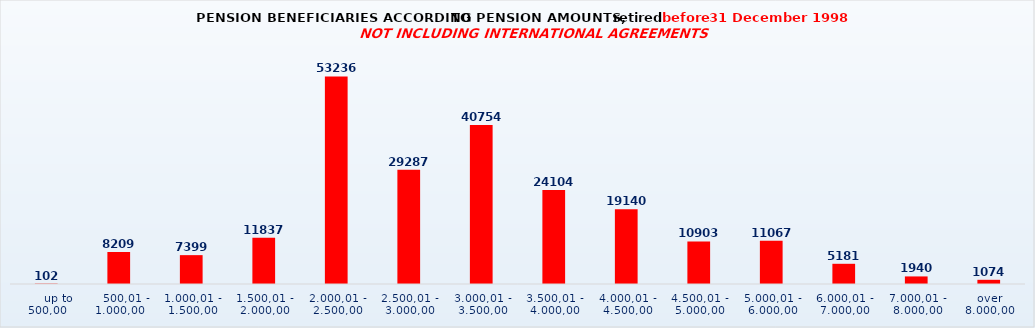
| Category | Series 0 |
|---|---|
|      up to 500,00 | 102 |
|    500,01 - 1.000,00 | 8209 |
| 1.000,01 - 1.500,00 | 7399 |
| 1.500,01 - 2.000,00 | 11837 |
| 2.000,01 - 2.500,00 | 53236 |
| 2.500,01 - 3.000,00 | 29287 |
| 3.000,01 - 3.500,00 | 40754 |
| 3.500,01 - 4.000,00 | 24104 |
| 4.000,01 - 4.500,00 | 19140 |
| 4.500,01 - 5.000,00 | 10903 |
| 5.000,01 - 6.000,00 | 11067 |
| 6.000,01 - 7.000,00 | 5181 |
| 7.000,01 - 8.000,00 | 1940 |
| over 8.000,00 | 1074 |